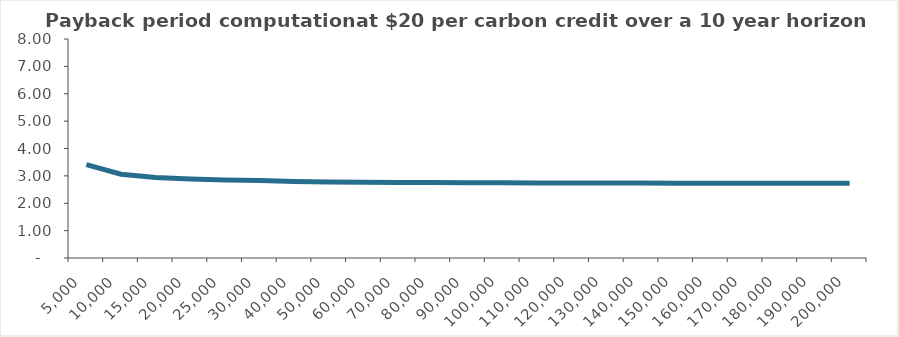
| Category | Payback period |
|---|---|
| 5000.0 | 3.412 |
| 10000.0 | 3.061 |
| 15000.0 | 2.944 |
| 20000.0 | 2.886 |
| 25000.0 | 2.851 |
| 30000.0 | 2.827 |
| 40000.0 | 2.798 |
| 50000.0 | 2.78 |
| 60000.0 | 2.769 |
| 70000.0 | 2.76 |
| 80000.0 | 2.754 |
| 90000.0 | 2.749 |
| 100000.0 | 2.745 |
| 110000.0 | 2.742 |
| 120000.0 | 2.739 |
| 130000.0 | 2.737 |
| 140000.0 | 2.735 |
| 150000.0 | 2.734 |
| 160000.0 | 2.732 |
| 170000.0 | 2.731 |
| 180000.0 | 2.73 |
| 190000.0 | 2.729 |
| 200000.0 | 2.728 |